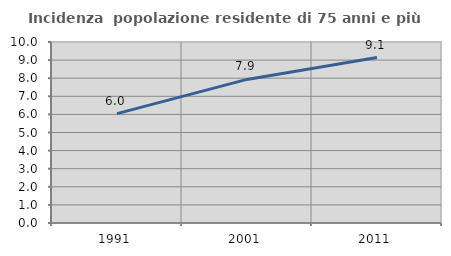
| Category | Incidenza  popolazione residente di 75 anni e più |
|---|---|
| 1991.0 | 6.042 |
| 2001.0 | 7.934 |
| 2011.0 | 9.141 |